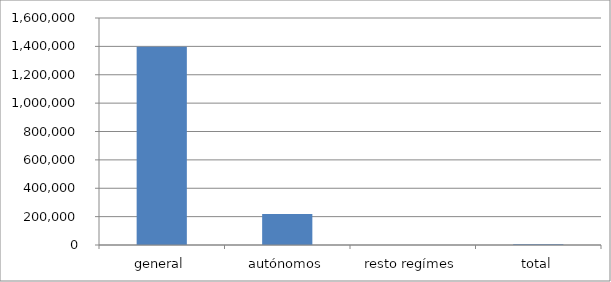
| Category | Series 0 |
|---|---|
| general | 1396627.67 |
| autónomos | 217776.08 |
| resto regímes | 0 |
| total | 4558.72 |